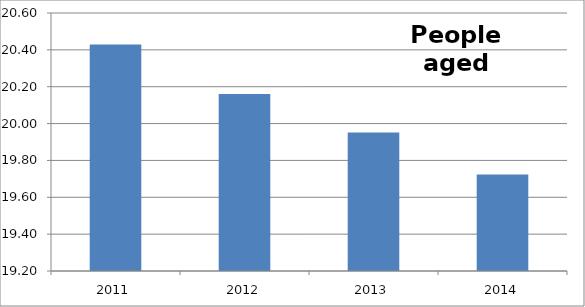
| Category | Series 0 |
|---|---|
| 2011 | 20.429 |
| 2012 | 20.161 |
| 2013 | 19.951 |
| 2014 | 19.724 |